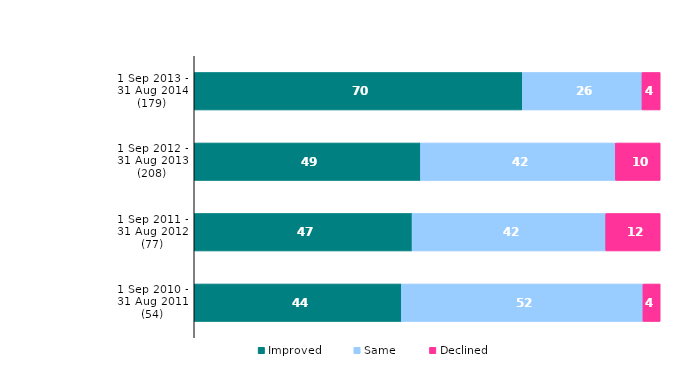
| Category | Improved | Same | Declined |
|---|---|---|---|
| 1 Sep 2013 - 31 Aug 2014 (179) | 70.391 | 25.698 | 3.911 |
| 1 Sep 2012 - 31 Aug 2013 (208) | 48.558 | 41.827 | 9.615 |
| 1 Sep 2011 - 31 Aug 2012 (77) | 46.753 | 41.558 | 11.688 |
| 1 Sep 2010 - 31 Aug 2011 (54) | 44.444 | 51.852 | 3.704 |